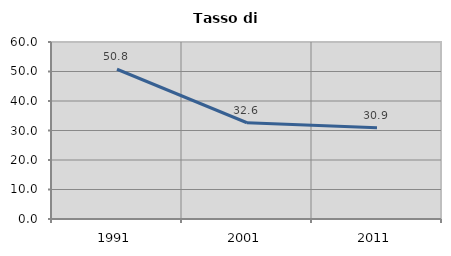
| Category | Tasso di disoccupazione   |
|---|---|
| 1991.0 | 50.767 |
| 2001.0 | 32.629 |
| 2011.0 | 30.891 |